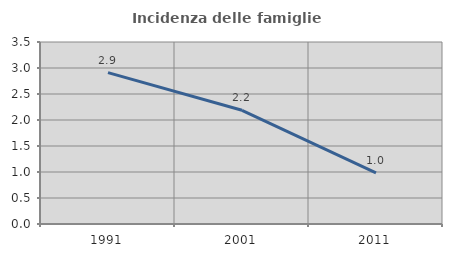
| Category | Incidenza delle famiglie numerose |
|---|---|
| 1991.0 | 2.912 |
| 2001.0 | 2.186 |
| 2011.0 | 0.982 |